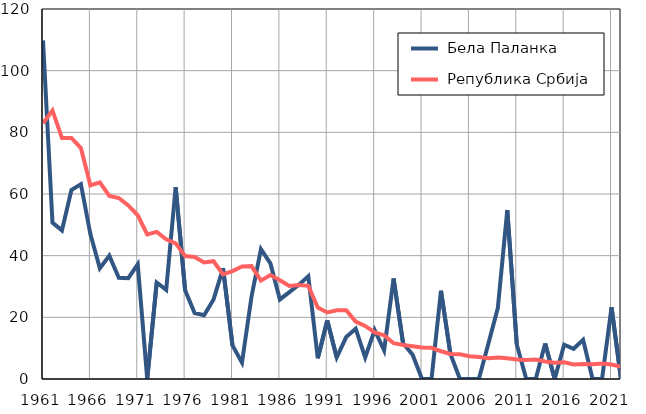
| Category |  Бела Паланка |  Република Србија |
|---|---|---|
| 1961.0 | 109.8 | 82.9 |
| 1962.0 | 50.7 | 87.1 |
| 1963.0 | 48.2 | 78.2 |
| 1964.0 | 61.3 | 78.2 |
| 1965.0 | 63.2 | 74.9 |
| 1966.0 | 47 | 62.8 |
| 1967.0 | 35.9 | 63.8 |
| 1968.0 | 40 | 59.4 |
| 1969.0 | 32.8 | 58.7 |
| 1970.0 | 32.7 | 56.3 |
| 1971.0 | 37.2 | 53.1 |
| 1972.0 | 0 | 46.9 |
| 1973.0 | 31.3 | 47.7 |
| 1974.0 | 28.9 | 45.3 |
| 1975.0 | 62.2 | 44 |
| 1976.0 | 28.8 | 39.9 |
| 1977.0 | 21.4 | 39.6 |
| 1978.0 | 20.7 | 37.8 |
| 1979.0 | 25.8 | 38.2 |
| 1980.0 | 35.9 | 33.9 |
| 1981.0 | 10.9 | 35 |
| 1982.0 | 5.3 | 36.5 |
| 1983.0 | 26.6 | 36.6 |
| 1984.0 | 42.1 | 31.9 |
| 1985.0 | 37.5 | 33.7 |
| 1986.0 | 25.8 | 32 |
| 1987.0 | 28.2 | 30.2 |
| 1988.0 | 30.6 | 30.5 |
| 1989.0 | 33.3 | 30.2 |
| 1990.0 | 6.7 | 23.2 |
| 1991.0 | 19 | 21.6 |
| 1992.0 | 7 | 22.3 |
| 1993.0 | 13.6 | 22.3 |
| 1994.0 | 16.3 | 18.6 |
| 1995.0 | 7 | 17.2 |
| 1996.0 | 15.9 | 15.1 |
| 1997.0 | 9.3 | 14.2 |
| 1998.0 | 32.6 | 11.6 |
| 1999.0 | 11.6 | 11 |
| 2000.0 | 7.9 | 10.6 |
| 2001.0 | 0 | 10.2 |
| 2002.0 | 0 | 10.1 |
| 2003.0 | 28.6 | 9 |
| 2004.0 | 8.1 | 8.1 |
| 2005.0 | 0 | 8 |
| 2006.0 | 0 | 7.4 |
| 2007.0 | 0 | 7.1 |
| 2008.0 | 11.4 | 6.7 |
| 2009.0 | 23 | 7 |
| 2010.0 | 54.8 | 6.7 |
| 2011.0 | 11.2 | 6.3 |
| 2012.0 | 0 | 6.2 |
| 2013.0 | 0 | 6.3 |
| 2014.0 | 11.5 | 5.7 |
| 2015.0 | 0 | 5.3 |
| 2016.0 | 11.1 | 5.4 |
| 2017.0 | 9.8 | 4.7 |
| 2018.0 | 12.7 | 4.9 |
| 2019.0 | 0 | 4.8 |
| 2020.0 | 0 | 5 |
| 2021.0 | 23.3 | 4.7 |
| 2022.0 | 0 | 4 |